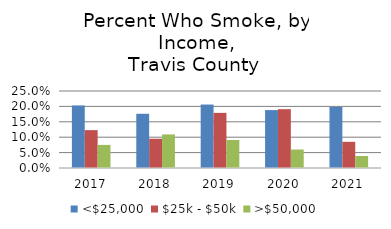
| Category | <$25,000 | $25k - $50k | >$50,000 |
|---|---|---|---|
| 2017.0 | 0.203 | 0.123 | 0.075 |
| 2018.0 | 0.176 | 0.095 | 0.109 |
| 2019.0 | 0.206 | 0.179 | 0.091 |
| 2020.0 | 0.188 | 0.191 | 0.06 |
| 2021.0 | 0.198 | 0.085 | 0.039 |